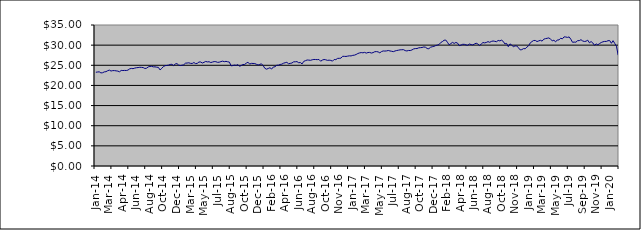
| Category | Series 0 |
|---|---|
| 2014-01-09 | 23.271 |
| 2014-01-17 | 23.331 |
| 2014-01-23 | 23.38 |
| 2014-01-31 | 23.105 |
| 2014-02-10 | 23.154 |
| 2014-02-14 | 23.363 |
| 2014-02-20 | 23.414 |
| 2014-02-28 | 23.655 |
| 2014-03-10 | 23.796 |
| 2014-03-14 | 23.57 |
| 2014-03-20 | 23.682 |
| 2014-03-26 | 23.679 |
| 2014-03-31 | 23.619 |
| 2014-04-09 | 23.552 |
| 2014-04-15 | 23.391 |
| 2014-04-24 | 23.719 |
| 2014-04-30 | 23.696 |
| 2014-05-08 | 23.728 |
| 2014-05-16 | 23.706 |
| 2014-05-22 | 23.804 |
| 2014-05-31 | 24.105 |
| 2014-06-09 | 24.218 |
| 2014-06-16 | 24.162 |
| 2014-06-20 | 24.297 |
| 2014-06-30 | 24.393 |
| 2014-07-09 | 24.436 |
| 2014-07-15 | 24.508 |
| 2014-07-22 | 24.479 |
| 2014-07-31 | 24.432 |
| 2014-08-11 | 24.205 |
| 2014-08-14 | 24.276 |
| 2014-08-21 | 24.601 |
| 2014-08-30 | 24.716 |
| 2014-09-08 | 24.748 |
| 2014-09-16 | 24.609 |
| 2014-09-23 | 24.611 |
| 2014-09-30 | 24.533 |
| 2014-10-09 | 24.479 |
| 2014-10-16 | 23.843 |
| 2014-10-23 | 24.237 |
| 2014-10-31 | 24.693 |
| 2014-11-10 | 24.904 |
| 2014-11-13 | 24.956 |
| 2014-11-20 | 25.032 |
| 2014-11-29 | 25.206 |
| 2014-12-10 | 25.24 |
| 2014-12-18 | 24.922 |
| 2014-12-23 | 25.323 |
| 2014-12-30 | 25.42 |
| 2015-01-08 | 25.041 |
| 2015-01-15 | 24.939 |
| 2015-01-30 | 25.012 |
| 2015-02-10 | 25.121 |
| 2015-02-16 | 25.514 |
| 2015-02-19 | 25.562 |
| 2015-02-28 | 25.615 |
| 2015-03-10 | 25.481 |
| 2015-03-13 | 25.451 |
| 2015-03-19 | 25.686 |
| 2015-03-27 | 25.421 |
| 2015-04-07 | 25.48 |
| 2015-04-16 | 25.815 |
| 2015-04-27 | 25.812 |
| 2015-05-08 | 25.559 |
| 2015-05-14 | 25.736 |
| 2015-05-21 | 25.948 |
| 2015-05-27 | 25.84 |
| 2015-06-03 | 25.88 |
| 2015-06-09 | 25.678 |
| 2015-06-15 | 25.796 |
| 2015-06-22 | 25.92 |
| 2015-06-26 | 25.897 |
| 2015-07-02 | 25.731 |
| 2015-07-09 | 25.768 |
| 2015-07-14 | 25.916 |
| 2015-07-23 | 26.024 |
| 2015-07-29 | 25.894 |
| 2015-08-06 | 25.982 |
| 2015-08-13 | 25.867 |
| 2015-08-20 | 25.79 |
| 2015-08-27 | 24.872 |
| 2015-09-03 | 24.924 |
| 2015-09-09 | 25.055 |
| 2015-09-15 | 24.966 |
| 2015-09-21 | 25.184 |
| 2015-09-28 | 24.748 |
| 2015-10-07 | 24.957 |
| 2015-10-13 | 25.19 |
| 2015-10-22 | 25.205 |
| 2015-10-28 | 25.519 |
| 2015-11-04 | 25.772 |
| 2015-11-13 | 25.296 |
| 2015-11-19 | 25.475 |
| 2015-11-27 | 25.452 |
| 2015-12-03 | 25.436 |
| 2015-12-10 | 25.249 |
| 2015-12-15 | 25.064 |
| 2015-12-23 | 25.225 |
| 2015-12-29 | 25.363 |
| 2016-01-07 | 24.91 |
| 2016-01-14 | 24.234 |
| 2016-01-21 | 24.038 |
| 2016-01-28 | 24.213 |
| 2016-02-04 | 24.389 |
| 2016-02-11 | 24.068 |
| 2016-02-18 | 24.581 |
| 2016-02-25 | 24.633 |
| 2016-03-03 | 25.008 |
| 2016-03-10 | 25.023 |
| 2016-03-16 | 25.203 |
| 2016-03-29 | 25.276 |
| 2016-04-07 | 25.513 |
| 2016-04-14 | 25.639 |
| 2016-04-28 | 25.733 |
| 2016-05-05 | 25.378 |
| 2016-05-12 | 25.472 |
| 2016-05-19 | 25.566 |
| 2016-05-30 | 25.852 |
| 2016-06-03 | 25.871 |
| 2016-06-09 | 25.914 |
| 2016-06-15 | 25.633 |
| 2016-06-23 | 25.685 |
| 2016-06-29 | 25.336 |
| 2016-07-11 | 25.973 |
| 2016-07-14 | 26.146 |
| 2016-07-21 | 26.315 |
| 2016-07-28 | 26.282 |
| 2016-08-04 | 26.232 |
| 2016-08-11 | 26.369 |
| 2016-08-16 | 26.446 |
| 2016-08-24 | 26.43 |
| 2016-08-30 | 26.405 |
| 2016-09-08 | 26.449 |
| 2016-09-15 | 26.011 |
| 2016-09-22 | 26.294 |
| 2016-09-29 | 26.436 |
| 2016-10-06 | 26.367 |
| 2016-10-13 | 26.225 |
| 2016-10-20 | 26.273 |
| 2016-10-28 | 26.21 |
| 2016-11-03 | 26.031 |
| 2016-11-10 | 26.452 |
| 2016-11-15 | 26.401 |
| 2016-11-23 | 26.714 |
| 2016-11-29 | 26.725 |
| 2016-12-07 | 26.77 |
| 2016-12-14 | 27.233 |
| 2016-12-21 | 27.218 |
| 2016-12-28 | 27.195 |
| 2017-01-05 | 27.275 |
| 2017-01-16 | 27.351 |
| 2017-01-23 | 27.328 |
| 2017-01-30 | 27.466 |
| 2017-02-06 | 27.517 |
| 2017-02-13 | 27.681 |
| 2017-02-20 | 27.925 |
| 2017-02-27 | 28.066 |
| 2017-03-06 | 28.154 |
| 2017-03-13 | 28.098 |
| 2017-03-20 | 28.202 |
| 2017-03-27 | 28.021 |
| 2017-03-30 | 28.173 |
| 2017-04-10 | 28.19 |
| 2017-04-18 | 28.038 |
| 2017-04-24 | 28.144 |
| 2017-04-28 | 28.365 |
| 2017-05-08 | 28.399 |
| 2017-05-15 | 28.323 |
| 2017-05-22 | 28.09 |
| 2017-05-30 | 28.401 |
| 2017-06-06 | 28.555 |
| 2017-06-12 | 28.528 |
| 2017-06-15 | 28.57 |
| 2017-06-20 | 28.676 |
| 2017-06-29 | 28.558 |
| 2017-07-04 | 28.477 |
| 2017-07-10 | 28.386 |
| 2017-07-14 | 28.554 |
| 2017-07-19 | 28.665 |
| 2017-07-24 | 28.744 |
| 2017-07-28 | 28.835 |
| 2017-08-03 | 28.856 |
| 2017-08-09 | 28.877 |
| 2017-08-14 | 28.649 |
| 2017-08-21 | 28.554 |
| 2017-08-24 | 28.679 |
| 2017-08-30 | 28.658 |
| 2017-09-07 | 28.807 |
| 2017-09-14 | 29.055 |
| 2017-09-20 | 29.151 |
| 2017-09-29 | 29.153 |
| 2017-10-05 | 29.33 |
| 2017-10-11 | 29.375 |
| 2017-10-16 | 29.416 |
| 2017-10-23 | 29.548 |
| 2017-10-30 | 29.482 |
| 2017-11-07 | 29.16 |
| 2017-11-15 | 29.111 |
| 2017-11-23 | 29.473 |
| 2017-11-29 | 29.604 |
| 2017-12-07 | 29.691 |
| 2017-12-13 | 29.879 |
| 2017-12-18 | 30.001 |
| 2017-12-28 | 30.14 |
| 2018-01-08 | 30.629 |
| 2018-01-17 | 30.875 |
| 2018-01-24 | 31.212 |
| 2018-01-30 | 31.262 |
| 2018-02-05 | 30.715 |
| 2018-02-13 | 30.076 |
| 2018-02-19 | 30.382 |
| 2018-02-27 | 30.682 |
| 2018-03-07 | 30.428 |
| 2018-03-14 | 30.666 |
| 2018-03-21 | 30.494 |
| 2018-03-29 | 29.874 |
| 2018-04-10 | 29.993 |
| 2018-04-16 | 30.209 |
| 2018-04-23 | 30.199 |
| 2018-04-27 | 30.054 |
| 2018-05-10 | 29.969 |
| 2018-05-15 | 30.286 |
| 2018-05-22 | 30.137 |
| 2018-05-30 | 30.047 |
| 2018-06-06 | 30.292 |
| 2018-06-13 | 30.478 |
| 2018-06-20 | 30.287 |
| 2018-06-29 | 29.896 |
| 2018-07-10 | 30.257 |
| 2018-07-16 | 30.649 |
| 2018-07-23 | 30.56 |
| 2018-07-30 | 30.666 |
| 2018-08-07 | 30.875 |
| 2018-08-13 | 30.705 |
| 2018-08-24 | 30.92 |
| 2018-08-30 | 31.031 |
| 2018-09-06 | 30.95 |
| 2018-09-13 | 30.847 |
| 2018-09-24 | 31.164 |
| 2018-09-28 | 31.06 |
| 2018-10-04 | 31.233 |
| 2018-10-10 | 30.934 |
| 2018-10-16 | 30.298 |
| 2018-10-23 | 30.428 |
| 2018-10-30 | 29.618 |
| 2018-11-07 | 30.312 |
| 2018-11-15 | 30.016 |
| 2018-11-21 | 29.623 |
| 2018-11-29 | 29.814 |
| 2018-12-07 | 29.8 |
| 2018-12-14 | 29.353 |
| 2018-12-21 | 28.829 |
| 2018-12-28 | 28.88 |
| 2019-01-08 | 29.142 |
| 2019-01-14 | 29.104 |
| 2019-01-21 | 29.511 |
| 2019-01-30 | 29.839 |
| 2019-02-11 | 30.559 |
| 2019-02-14 | 30.878 |
| 2019-02-21 | 31.153 |
| 2019-02-27 | 31.162 |
| 2019-03-07 | 30.893 |
| 2019-03-14 | 31.049 |
| 2019-03-21 | 31.203 |
| 2019-03-29 | 31.003 |
| 2019-04-04 | 31.479 |
| 2019-04-12 | 31.615 |
| 2019-04-18 | 31.703 |
| 2019-04-29 | 31.798 |
| 2019-05-08 | 31.489 |
| 2019-05-15 | 31.088 |
| 2019-05-23 | 31.214 |
| 2019-05-30 | 30.813 |
| 2019-06-10 | 31.287 |
| 2019-06-14 | 31.295 |
| 2019-06-21 | 31.715 |
| 2019-06-28 | 31.561 |
| 2019-07-04 | 32.055 |
| 2019-07-15 | 32.021 |
| 2019-07-22 | 31.917 |
| 2019-07-30 | 32.038 |
| 2019-08-06 | 31.478 |
| 2019-08-16 | 30.708 |
| 2019-08-22 | 30.756 |
| 2019-08-30 | 30.733 |
| 2019-09-09 | 31.107 |
| 2019-09-16 | 31.123 |
| 2019-09-20 | 31.357 |
| 2019-09-27 | 31.041 |
| 2019-10-03 | 30.905 |
| 2019-10-09 | 30.971 |
| 2019-10-15 | 31.237 |
| 2019-10-30 | 30.589 |
| 2019-11-07 | 30.886 |
| 2019-11-14 | 30.551 |
| 2019-11-21 | 29.957 |
| 2019-11-29 | 30.308 |
| 2019-12-05 | 30.076 |
| 2019-12-11 | 30.4 |
| 2019-12-17 | 30.649 |
| 2019-12-23 | 30.829 |
| 2019-12-30 | 30.923 |
| 2020-01-07 | 30.918 |
| 2020-01-15 | 31.103 |
| 2020-01-22 | 31.13 |
| 2020-01-30 | 30.46 |
| 2020-02-06 | 31.111 |
| 2020-02-14 | 30.408 |
| 2020-02-20 | 29.739 |
| 2020-02-28 | 27.507 |